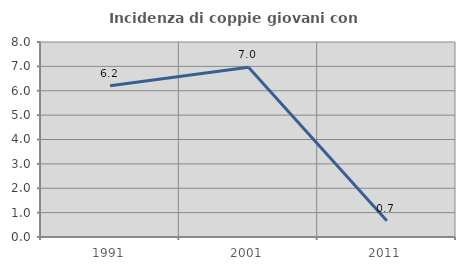
| Category | Incidenza di coppie giovani con figli |
|---|---|
| 1991.0 | 6.207 |
| 2001.0 | 6.962 |
| 2011.0 | 0.667 |